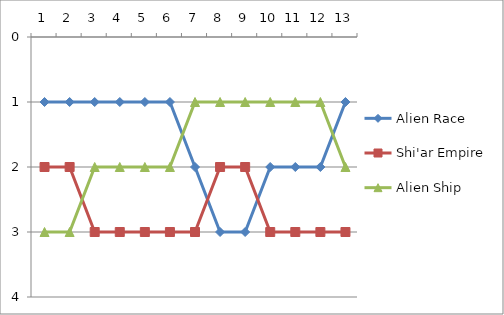
| Category | Alien Race | Shi'ar Empire | Alien Ship |
|---|---|---|---|
| 0 | 1 | 2 | 3 |
| 1 | 1 | 2 | 3 |
| 2 | 1 | 3 | 2 |
| 3 | 1 | 3 | 2 |
| 4 | 1 | 3 | 2 |
| 5 | 1 | 3 | 2 |
| 6 | 2 | 3 | 1 |
| 7 | 3 | 2 | 1 |
| 8 | 3 | 2 | 1 |
| 9 | 2 | 3 | 1 |
| 10 | 2 | 3 | 1 |
| 11 | 2 | 3 | 1 |
| 12 | 1 | 3 | 2 |